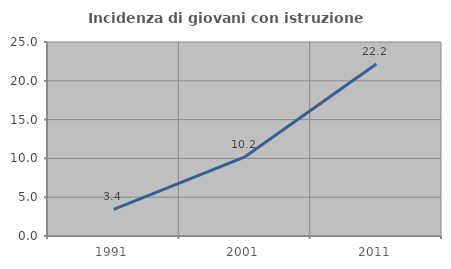
| Category | Incidenza di giovani con istruzione universitaria |
|---|---|
| 1991.0 | 3.431 |
| 2001.0 | 10.204 |
| 2011.0 | 22.176 |